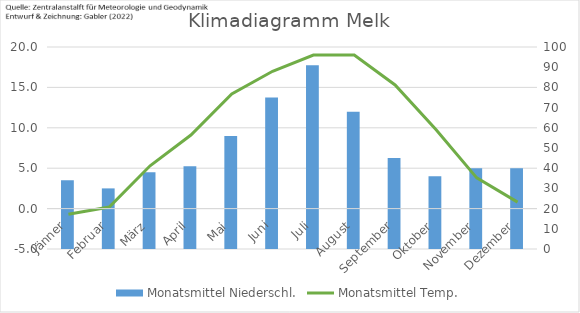
| Category | Monatsmittel Niederschl. |
|---|---|
| Jänner | 34 |
| Februar | 30 |
| März | 38 |
| April | 41 |
| Mai | 56 |
| Juni | 75 |
| Juli | 91 |
| August | 68 |
| September | 45 |
| Oktober | 36 |
| November | 40 |
| Dezember | 40 |